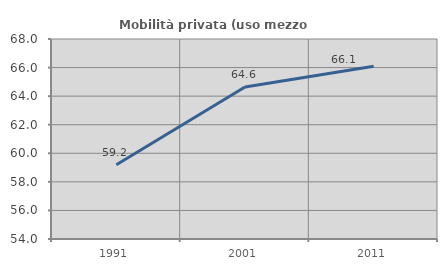
| Category | Mobilità privata (uso mezzo privato) |
|---|---|
| 1991.0 | 59.203 |
| 2001.0 | 64.637 |
| 2011.0 | 66.089 |